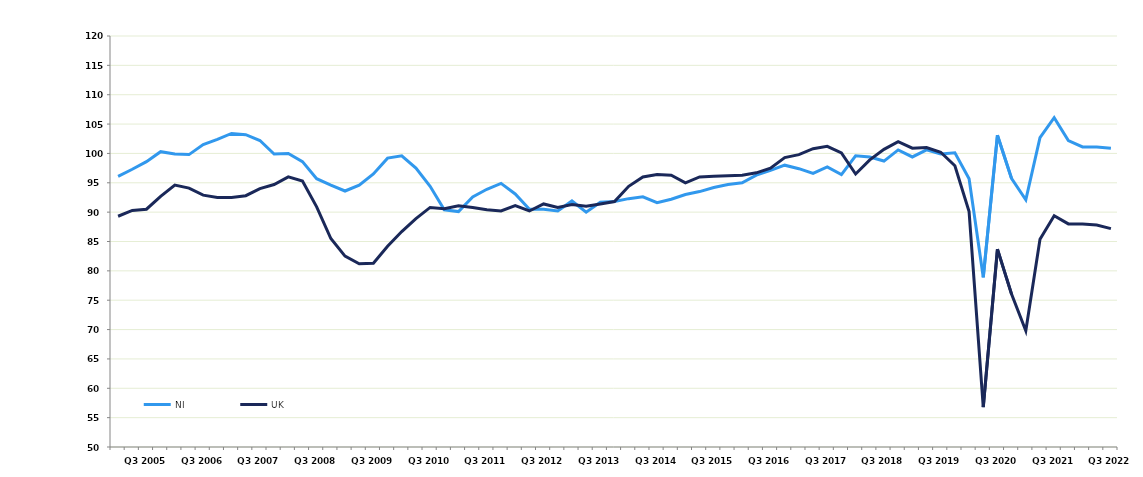
| Category | NI | UK |
|---|---|---|
|  | 96.1 | 89.3 |
|  | 97.3 | 90.3 |
| Q3 2005 | 98.6 | 90.5 |
|  | 100.3 | 92.7 |
|  | 99.9 | 94.6 |
|  | 99.8 | 94.1 |
| Q3 2006 | 101.5 | 92.9 |
|  | 102.4 | 92.5 |
|  | 103.4 | 92.5 |
|  | 103.2 | 92.8 |
| Q3 2007 | 102.2 | 94 |
|  | 99.9 | 94.7 |
|  | 100 | 96 |
|  | 98.6 | 95.3 |
| Q3 2008 | 95.7 | 90.9 |
|  | 94.6 | 85.5 |
|  | 93.6 | 82.5 |
|  | 94.6 | 81.2 |
| Q3 2009 | 96.5 | 81.3 |
|  | 99.2 | 84.2 |
|  | 99.6 | 86.7 |
|  | 97.5 | 88.9 |
| Q3 2010 | 94.4 | 90.8 |
|  | 90.4 | 90.6 |
|  | 90.1 | 91.1 |
|  | 92.6 | 90.8 |
| Q3 2011 | 93.9 | 90.4 |
|  | 94.9 | 90.2 |
|  | 93.1 | 91.1 |
|  | 90.5 | 90.2 |
| Q3 2012 | 90.5 | 91.4 |
|  | 90.2 | 90.8 |
|  | 91.9 | 91.3 |
|  | 90 | 91 |
| Q3 2013 | 91.7 | 91.4 |
|  | 91.8 | 91.8 |
|  | 92.3 | 94.4 |
|  | 92.6 | 96 |
| Q3 2014 | 91.6 | 96.4 |
|  | 92.2 | 96.3 |
|  | 93 | 95 |
|  | 93.5 | 96 |
| Q3 2015 | 94.2 | 96.1 |
|  | 94.7 | 96.2 |
|  | 95 | 96.3 |
|  | 96.3 | 96.7 |
| Q3 2016 | 97.1 | 97.5 |
|  | 98 | 99.3 |
|  | 97.4 | 99.8 |
|  | 96.6 | 100.8 |
| Q3 2017 | 97.7 | 101.2 |
|  | 96.4 | 100.1 |
|  | 99.6 | 96.5 |
|  | 99.4 | 98.9 |
| Q3 2018 | 98.7 | 100.7 |
|  | 100.6 | 102 |
|  | 99.4 | 100.9 |
|  | 100.6 | 101 |
| Q3 2019 | 99.9 | 100.2 |
|  | 100.1 | 97.9 |
|  | 95.7 | 90.1 |
|  | 78.9 | 56.8 |
| Q3 2020 | 103.1 | 83.7 |
|  | 95.7 | 76 |
|  | 92.1 | 69.8 |
|  | 102.7 | 85.4 |
| Q3 2021 | 106.1 | 89.4 |
|  | 102.2 | 88 |
|  | 101.1 | 88 |
|  | 101.1 | 87.8 |
| Q3 2022 | 100.9 | 87.2 |